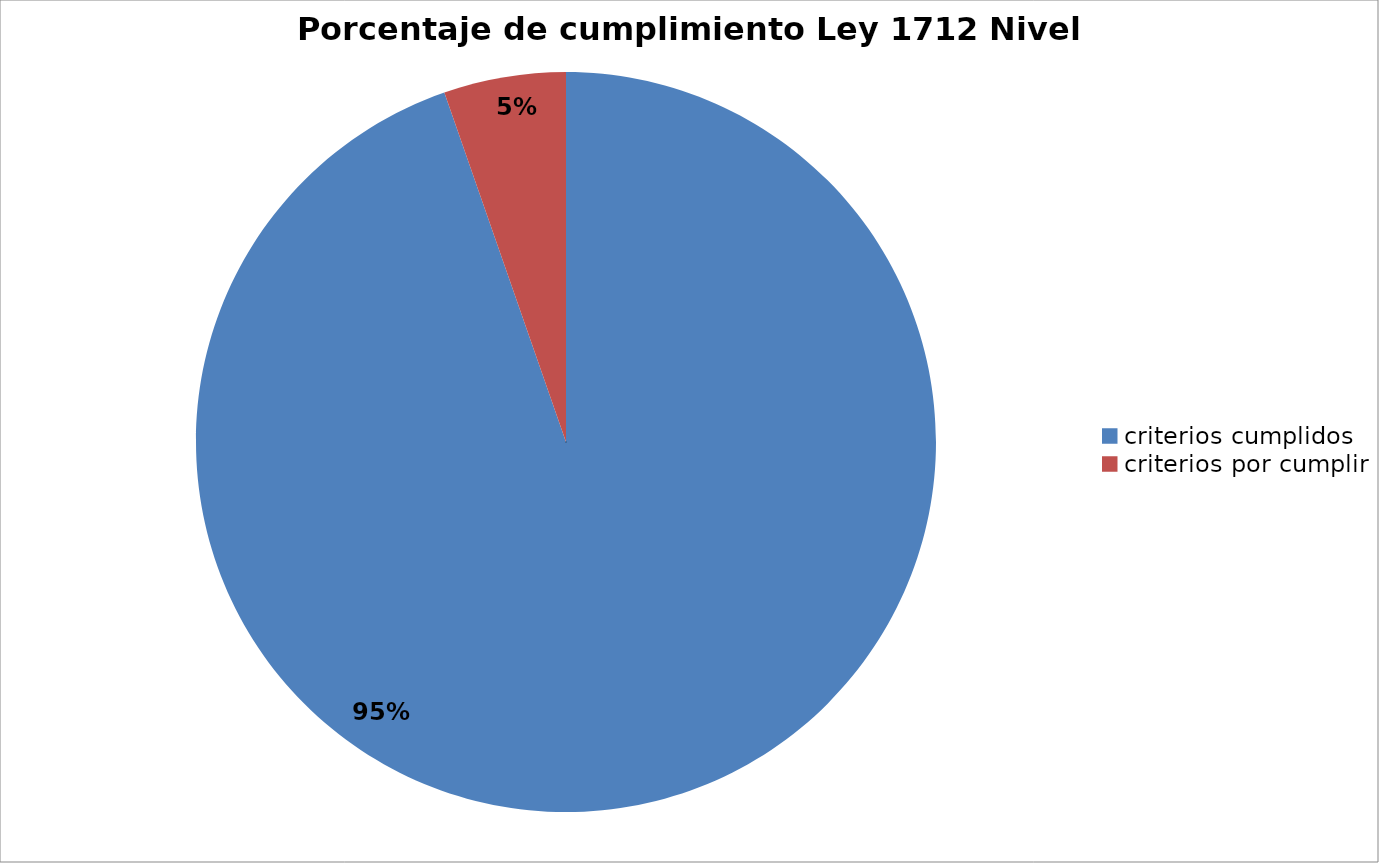
| Category | Series 0 |
|---|---|
| criterios cumplidos | 142 |
| criterios por cumplir | 8 |